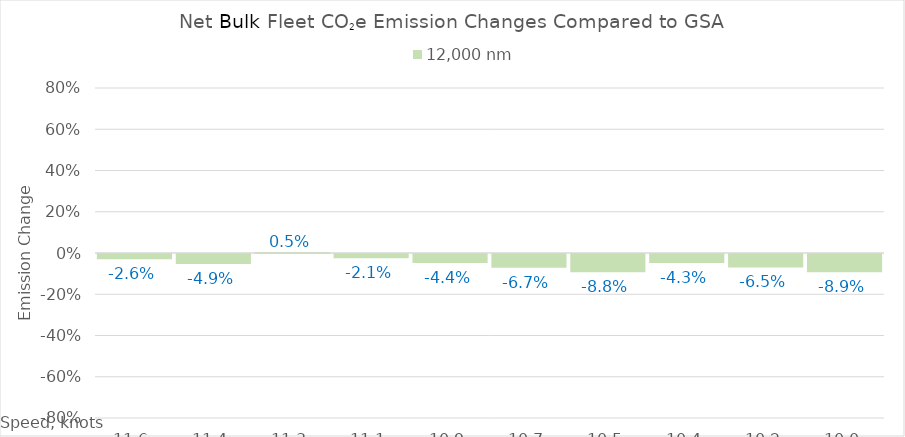
| Category | 12,000 |
|---|---|
| 11.620000000000001 | -0.026 |
| 11.440000000000001 | -0.049 |
| 11.260000000000002 | 0.005 |
| 11.080000000000002 | -0.021 |
| 10.900000000000002 | -0.044 |
| 10.720000000000002 | -0.067 |
| 10.540000000000003 | -0.088 |
| 10.360000000000003 | -0.043 |
| 10.180000000000003 | -0.065 |
| 10.000000000000004 | -0.089 |